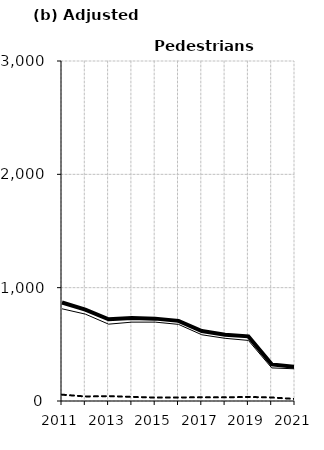
| Category | Built-up | Non built-up | Total |
|---|---|---|---|
| 2011.0 | 813.5 | 55.8 | 869.3 |
| 2012.0 | 766.7 | 40.2 | 806.9 |
| 2013.0 | 678 | 43 | 721 |
| 2014.0 | 695.9 | 36.1 | 731.9 |
| 2015.0 | 696 | 30.8 | 726.8 |
| 2016.0 | 676 | 31.1 | 707.2 |
| 2017.0 | 584.4 | 32.9 | 617.3 |
| 2018.0 | 553.1 | 32 | 585.1 |
| 2019.0 | 534.4 | 35.9 | 570.3 |
| 2020.0 | 292 | 31 | 323 |
| 2021.0 | 284 | 18 | 302 |